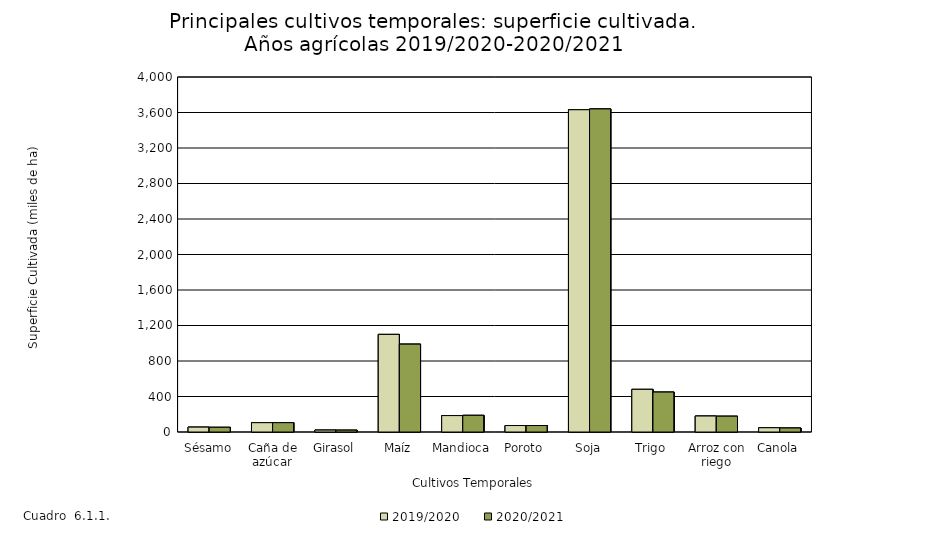
| Category | 2019/2020 | 2020/2021 |
|---|---|---|
| Sésamo | 55 | 53 |
| Caña de azúcar | 105 | 105 |
| Girasol | 21.6 | 20.8 |
| Maíz | 1100 | 990 |
| Mandioca | 185 | 188 |
| Poroto | 72.805 | 72.82 |
| Soja | 3631 | 3640 |
| Trigo | 480.8 | 450 |
| Arroz con riego | 180 | 178 |
| Canola | 47.85 | 45 |